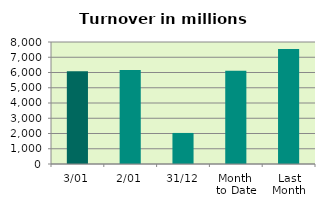
| Category | Series 0 |
|---|---|
| 3/01 | 6079.498 |
| 2/01 | 6158.133 |
| 31/12 | 2036.287 |
| Month 
to Date | 6118.815 |
| Last
Month | 7540.813 |